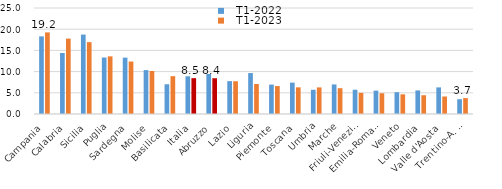
| Category |   T1-2022 |   T1-2023 |
|---|---|---|
|   Campania | 18.307 | 19.246 |
|   Calabria | 14.381 | 17.783 |
|   Sicilia | 18.732 | 16.946 |
|   Puglia | 13.319 | 13.597 |
|   Sardegna | 13.289 | 12.377 |
|   Molise | 10.35 | 10.151 |
|   Basilicata | 7.018 | 8.921 |
| Italia | 8.898 | 8.454 |
|   Abruzzo | 9.43 | 8.433 |
|   Lazio | 7.751 | 7.727 |
|   Liguria | 9.658 | 7.071 |
|   Piemonte | 6.932 | 6.593 |
|   Toscana | 7.404 | 6.289 |
|   Umbria | 5.713 | 6.274 |
|   Marche | 6.966 | 6.087 |
|   Friuli-Venezia G. | 5.725 | 4.981 |
|   Emilia-Romagna | 5.511 | 4.899 |
|   Veneto | 5.145 | 4.641 |
|   Lombardia | 5.56 | 4.428 |
|   Valle d'Aosta | 6.28 | 4.126 |
|   Trentino-A. Adige | 3.489 | 3.747 |